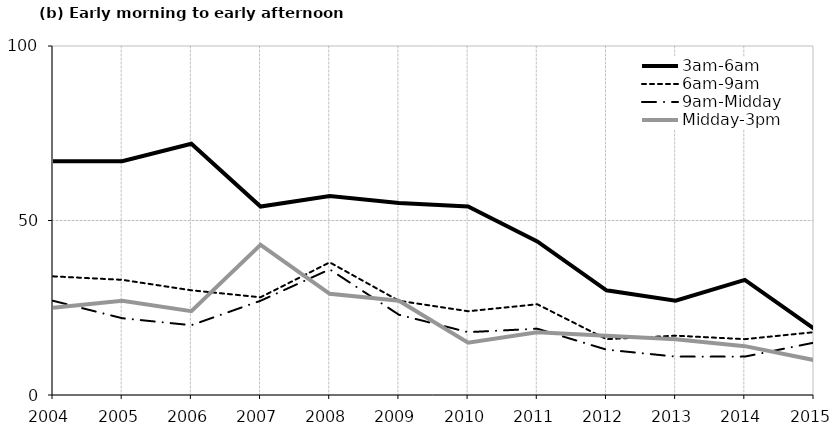
| Category | 3am-6am | 6am-9am | 9am-Midday | Midday-3pm |
|---|---|---|---|---|
| 2004.0 | 67 | 34 | 27 | 25 |
| 2005.0 | 67 | 33 | 22 | 27 |
| 2006.0 | 72 | 30 | 20 | 24 |
| 2007.0 | 54 | 28 | 27 | 43 |
| 2008.0 | 57 | 38 | 36 | 29 |
| 2009.0 | 55 | 27 | 23 | 27 |
| 2010.0 | 54 | 24 | 18 | 15 |
| 2011.0 | 44 | 26 | 19 | 18 |
| 2012.0 | 30 | 16 | 13 | 17 |
| 2013.0 | 27 | 17 | 11 | 16 |
| 2014.0 | 33 | 16 | 11 | 14 |
| 2015.0 | 19 | 18 | 15 | 10 |